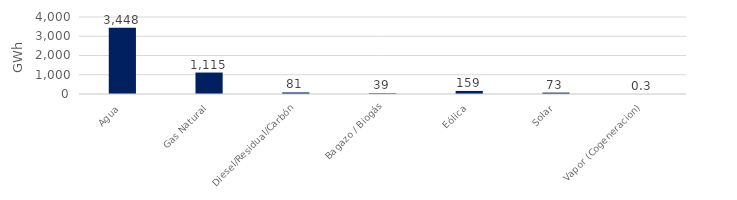
| Category | Series 0 |
|---|---|
| Agua | 3447.778 |
| Gas Natural | 1114.515 |
| Diesel/Residual/Carbón | 81.295 |
| Bagazo / Biogás | 39.467 |
| Eólica | 159.173 |
| Solar | 72.948 |
| Vapor (Cogeneracion) | 0.327 |